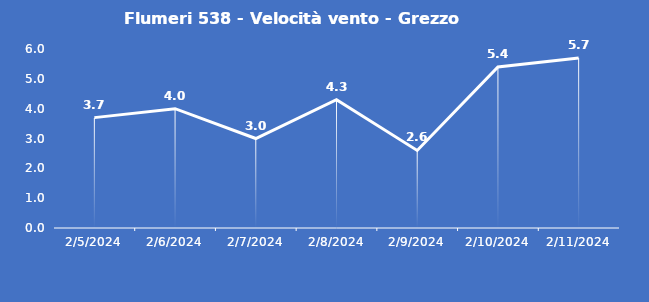
| Category | Flumeri 538 - Velocità vento - Grezzo (m/s) |
|---|---|
| 2/5/24 | 3.7 |
| 2/6/24 | 4 |
| 2/7/24 | 3 |
| 2/8/24 | 4.3 |
| 2/9/24 | 2.6 |
| 2/10/24 | 5.4 |
| 2/11/24 | 5.7 |